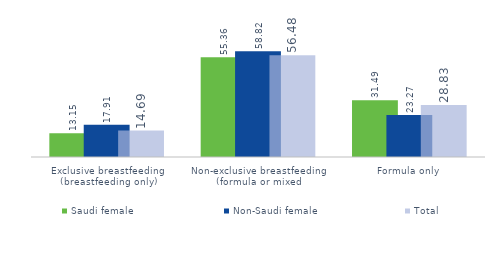
| Category | Saudi female  | Non-Saudi female | Total |
|---|---|---|---|
| Exclusive breastfeeding (breastfeeding only) | 13.153 | 17.915 | 14.695 |
| Non-exclusive breastfeeding (formula or mixed | 55.359 | 58.816 | 56.478 |
| Formula only | 31.488 | 23.269 | 28.827 |